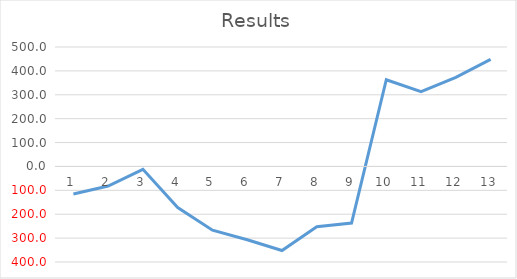
| Category | Series 0 |
|---|---|
| 0 | -115 |
| 1 | -82 |
| 2 | -12 |
| 3 | -172 |
| 4 | -267 |
| 5 | -307 |
| 6 | -352 |
| 7 | -252 |
| 8 | -237 |
| 9 | 363 |
| 10 | 313 |
| 11 | 373 |
| 12 | 448 |